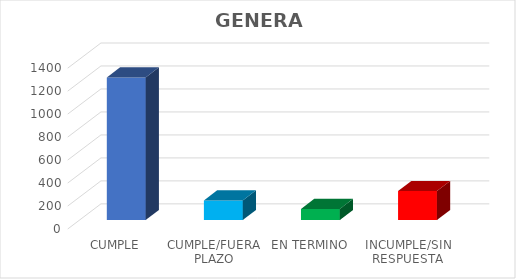
| Category | TOTAL |
|---|---|
| CUMPLE | 1241 |
| CUMPLE/FUERA PLAZO | 171 |
| EN TERMINO | 97 |
| INCUMPLE/SIN RESPUESTA | 253 |